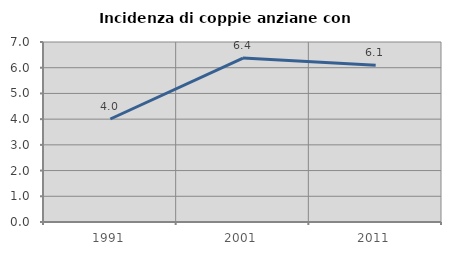
| Category | Incidenza di coppie anziane con figli |
|---|---|
| 1991.0 | 4.006 |
| 2001.0 | 6.375 |
| 2011.0 | 6.098 |